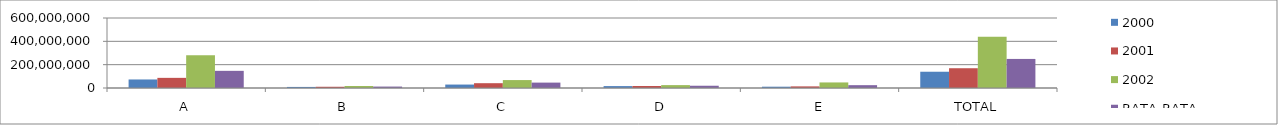
| Category | 2000 | 2001 | 2002 | RATA-RATA PERTUMBUHAN |
|---|---|---|---|---|
| A | 73151100 | 86929250 | 281096000 | 147058783.333 |
| B | 9163550 | 10561250 | 17015250 | 12246683.333 |
| C | 29540900 | 41201750 | 67996000 | 46246216.667 |
| D | 16392250 | 16940000 | 24748000 | 19360083.333 |
| E | 11177850 | 13844200 | 47685250 | 24235766.667 |
| TOTAL | 139427650 | 169478451 | 438542502 | 249147533.333 |